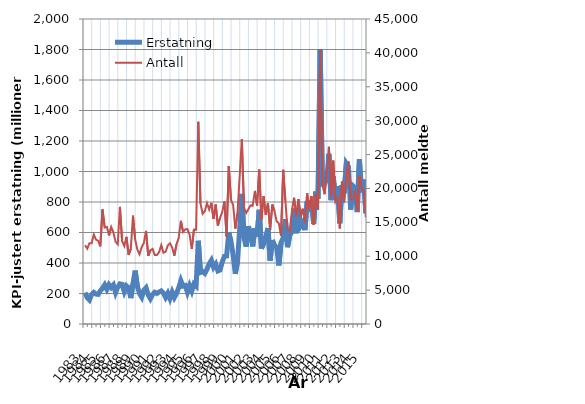
| Category | Erstatning |
|---|---|
| 1983.0 | 205.859 |
| nan | 172.439 |
| nan | 157.695 |
| nan | 193.17 |
| 1984.0 | 207.142 |
| nan | 195.941 |
| nan | 194.272 |
| nan | 217.294 |
| 1985.0 | 234.815 |
| nan | 256.66 |
| nan | 227.431 |
| nan | 257.937 |
| 1986.0 | 239.147 |
| nan | 255.898 |
| nan | 205.963 |
| nan | 241.024 |
| 1987.0 | 263.314 |
| nan | 259.842 |
| nan | 212.64 |
| nan | 250.177 |
| 1988.0 | 238.119 |
| nan | 169.742 |
| nan | 264.377 |
| nan | 350.226 |
| 1989.0 | 247.426 |
| nan | 199.98 |
| nan | 175.966 |
| nan | 222 |
| 1990.0 | 237.704 |
| nan | 191.233 |
| nan | 165.85 |
| nan | 193.043 |
| 1991.0 | 208.312 |
| nan | 200.291 |
| nan | 209.618 |
| nan | 216.719 |
| 1992.0 | 202.456 |
| nan | 174.447 |
| nan | 201.569 |
| nan | 166.334 |
| 1993.0 | 208.704 |
| nan | 173.688 |
| nan | 200.666 |
| nan | 237.394 |
| 1994.0 | 284.331 |
| nan | 248.57 |
| nan | 252.544 |
| nan | 208.159 |
| 1995.0 | 250.788 |
| nan | 215.752 |
| nan | 262.161 |
| nan | 248.909 |
| 1996.0 | 545.856 |
| nan | 338.003 |
| nan | 344.042 |
| nan | 331.801 |
| 1997.0 | 359.204 |
| nan | 394.166 |
| nan | 417.426 |
| nan | 372.44 |
| 1998.0 | 392.915 |
| nan | 348.086 |
| nan | 353.773 |
| nan | 406.622 |
| 1999.0 | 443.507 |
| nan | 445.662 |
| nan | 599.695 |
| nan | 543.103 |
| 2000.0 | 452.712 |
| nan | 328.768 |
| nan | 407.58 |
| nan | 621.434 |
| 2001.0 | 852.847 |
| nan | 564.588 |
| nan | 507.075 |
| nan | 641.553 |
| 2002.0 | 584.299 |
| nan | 508.397 |
| nan | 628.291 |
| nan | 572.513 |
| 2003.0 | 748.769 |
| nan | 495.059 |
| nan | 526.68 |
| nan | 573.74 |
| 2004.0 | 629.424 |
| nan | 416.133 |
| nan | 550.144 |
| nan | 514.216 |
| 2005.0 | 503.291 |
| nan | 384.081 |
| nan | 533.208 |
| nan | 565.067 |
| 2006.0 | 686.848 |
| nan | 503.708 |
| nan | 579.578 |
| nan | 604.661 |
| 2007.0 | 756.853 |
| nan | 595.046 |
| nan | 760.271 |
| nan | 642.795 |
| 2008.0 | 664.734 |
| nan | 615.377 |
| nan | 803.718 |
| nan | 771.888 |
| 2009.0 | 810.01 |
| nan | 657.599 |
| nan | 868.671 |
| nan | 821.076 |
| 2010.0 | 1801.107 |
| nan | 918.654 |
| nan | 923.074 |
| nan | 944.344 |
| 2011.0 | 1116.041 |
| nan | 811.559 |
| nan | 967.659 |
| nan | 815.509 |
| 2012.0 | 903.472 |
| nan | 660.521 |
| nan | 910.673 |
| nan | 857.485 |
| 2013.0 | 1053.081 |
| nan | 1031.165 |
| nan | 750.323 |
| nan | 906.303 |
| 2014.0 | 893.859 |
| nan | 734.034 |
| nan | 1079.804 |
| nan | 863.368 |
| 2015.0 | 947.227 |
| nan | 725.409 |